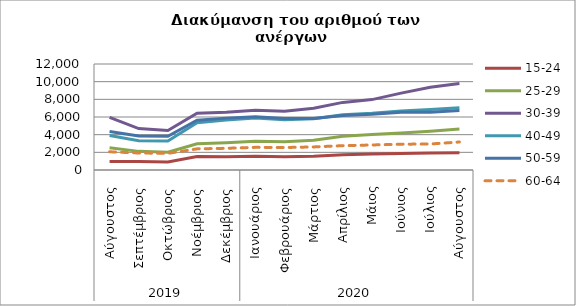
| Category | 15-24 | 25-29 | 30-39 | 40-49 | 50-59 | 60-64 |
|---|---|---|---|---|---|---|
| 0 | 950 | 2528 | 5962 | 3895 | 4356 | 2062 |
| 1 | 960 | 2109 | 4687 | 3310 | 3846 | 1924 |
| 2 | 919 | 2022 | 4478 | 3293 | 3811 | 1886 |
| 3 | 1537 | 2970 | 6427 | 5355 | 5640 | 2393 |
| 4 | 1503 | 3082 | 6550 | 5646 | 5873 | 2456 |
| 5 | 1553 | 3257 | 6759 | 5874 | 6042 | 2564 |
| 6 | 1509 | 3191 | 6656 | 5700 | 5841 | 2544 |
| 7 | 1555 | 3375 | 6990 | 5790 | 5839 | 2611 |
| 8 | 1729 | 3820 | 7653 | 6252 | 6167 | 2755 |
| 9 | 1820 | 4016 | 7970 | 6420 | 6304 | 2833 |
| 10 | 1873 | 4195 | 8705 | 6676 | 6525 | 2919 |
| 11 | 1925 | 4395 | 9372 | 6856 | 6551 | 2946 |
| 12 | 1953 | 4655 | 9784 | 7049 | 6737 | 3169 |